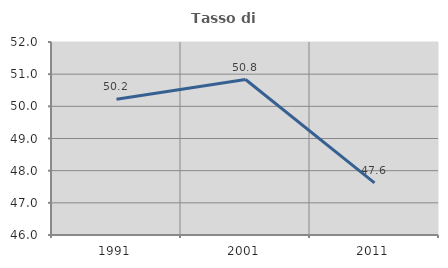
| Category | Tasso di occupazione   |
|---|---|
| 1991.0 | 50.22 |
| 2001.0 | 50.833 |
| 2011.0 | 47.619 |